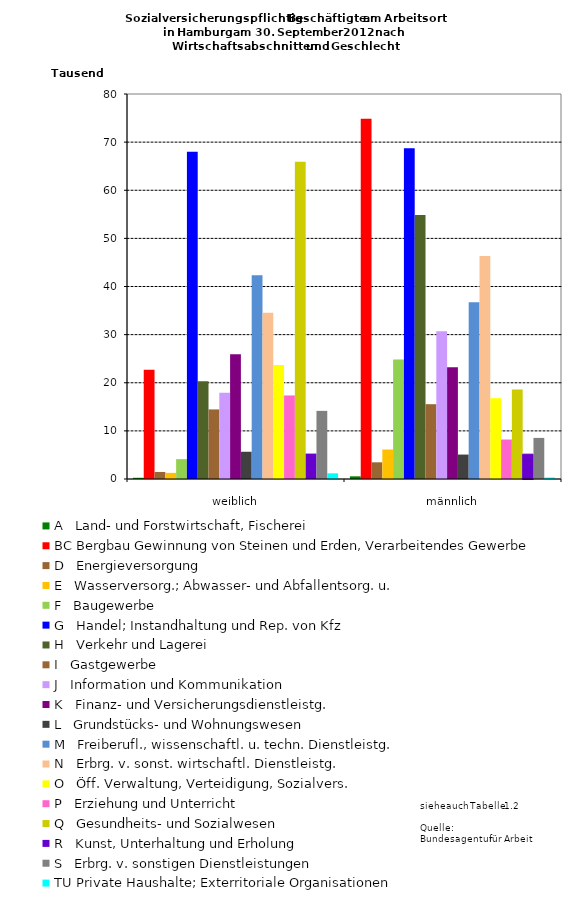
| Category | A   Land- und Forstwirtschaft, Fischerei | BC Bergbau Gewinnung von Steinen und Erden, Verarbeitendes Gewerbe | D   Energieversorgung | E   Wasserversorg.; Abwasser- und Abfallentsorg. u. | F   Baugewerbe | G   Handel; Instandhaltung und Rep. von Kfz | H   Verkehr und Lagerei | I   Gastgewerbe | J   Information und Kommunikation | K   Finanz- und Versicherungsdienstleistg. | L   Grundstücks- und Wohnungswesen | M   Freiberufl., wissenschaftl. u. techn. Dienstleistg. | N   Erbrg. v. sonst. wirtschaftl. Dienstleistg. | O   Öff. Verwaltung, Verteidigung, Sozialvers. | P   Erziehung und Unterricht | Q   Gesundheits- und Sozialwesen | R   Kunst, Unterhaltung und Erholung | S   Erbrg. v. sonstigen Dienstleistungen | TU Private Haushalte; Exterritoriale Organisationen |
|---|---|---|---|---|---|---|---|---|---|---|---|---|---|---|---|---|---|---|---|
| weiblich | 255 | 22691 | 1463 | 1275 | 4126 | 67984 | 20319 | 14459 | 17916 | 25909 | 5661 | 42335 | 34568 | 23702 | 17363 | 65947 | 5282 | 14157 | 1181 |
| männlich | 555 | 74837 | 3468 | 6124 | 24844 | 68709 | 54848 | 15546 | 30685 | 23201 | 5079 | 36710 | 46344 | 16798 | 8202 | 18589 | 5160 | 8539 | 301 |